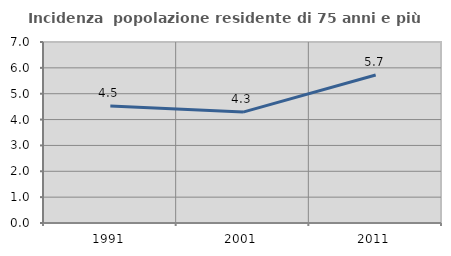
| Category | Incidenza  popolazione residente di 75 anni e più |
|---|---|
| 1991.0 | 4.527 |
| 2001.0 | 4.29 |
| 2011.0 | 5.725 |